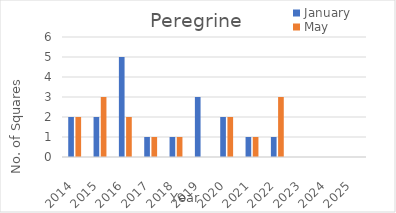
| Category | January | May |
|---|---|---|
| 2014.0 | 2 | 2 |
| 2015.0 | 2 | 3 |
| 2016.0 | 5 | 2 |
| 2017.0 | 1 | 1 |
| 2018.0 | 1 | 1 |
| 2019.0 | 3 | 0 |
| 2020.0 | 2 | 2 |
| 2021.0 | 1 | 1 |
| 2022.0 | 1 | 3 |
| 2023.0 | 0 | 0 |
| 2024.0 | 0 | 0 |
| 2025.0 | 0 | 0 |